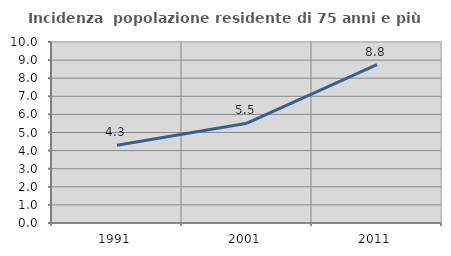
| Category | Incidenza  popolazione residente di 75 anni e più |
|---|---|
| 1991.0 | 4.296 |
| 2001.0 | 5.512 |
| 2011.0 | 8.751 |